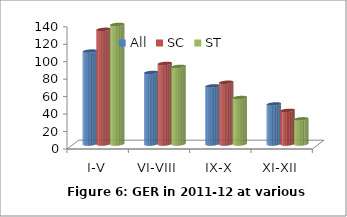
| Category | All | SC | ST |
|---|---|---|---|
| I-V | 106.452 | 131.364 | 136.962 |
| VI-VIII | 81.957 | 92.237 | 88.88 |
| IX-X | 66.584 | 70.718 | 53.256 |
| XI-XII | 45.873 | 38.511 | 28.802 |